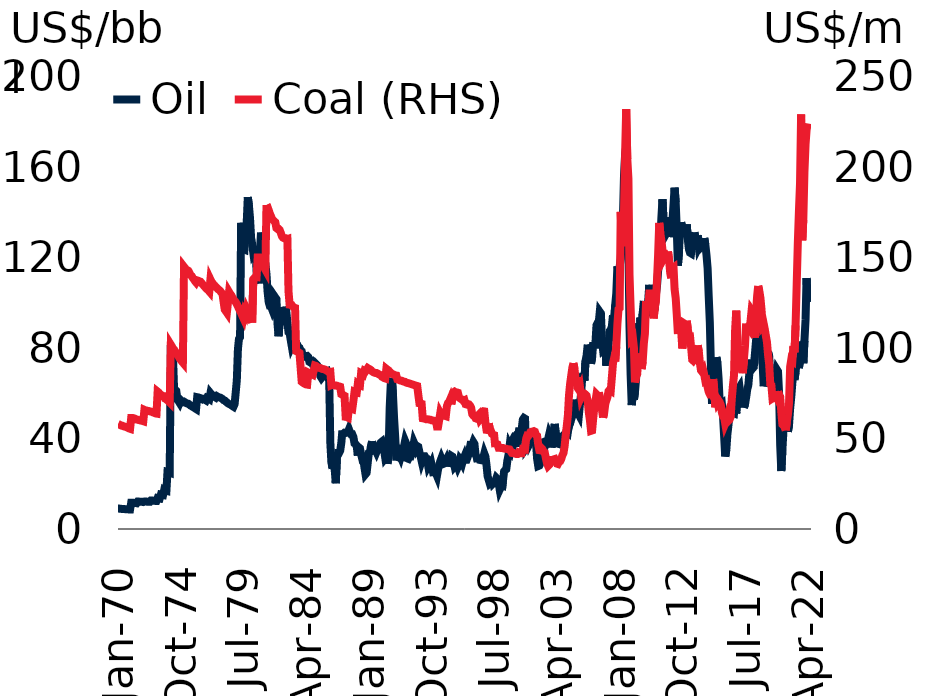
| Category | Oil |
|---|---|
| 1970-01-01 | 9 |
| 1970-02-01 | 9 |
| 1970-03-01 | 8.9 |
| 1970-04-01 | 8.9 |
| 1970-05-01 | 8.8 |
| 1970-06-01 | 8.8 |
| 1970-07-01 | 8.8 |
| 1970-08-01 | 8.7 |
| 1970-09-01 | 8.7 |
| 1970-10-01 | 8.7 |
| 1970-11-01 | 8.6 |
| 1970-12-01 | 8.6 |
| 1971-01-01 | 11.6 |
| 1971-02-01 | 11.6 |
| 1971-03-01 | 11.6 |
| 1971-04-01 | 11.5 |
| 1971-05-01 | 11.5 |
| 1971-06-01 | 11.4 |
| 1971-07-01 | 12.1 |
| 1971-08-01 | 12.1 |
| 1971-09-01 | 12 |
| 1971-10-01 | 12 |
| 1971-11-01 | 12 |
| 1971-12-01 | 11.9 |
| 1972-01-01 | 12.1 |
| 1972-02-01 | 12.1 |
| 1972-03-01 | 12.1 |
| 1972-04-01 | 12 |
| 1972-05-01 | 12 |
| 1972-06-01 | 12 |
| 1972-07-01 | 12.6 |
| 1972-08-01 | 12.6 |
| 1972-09-01 | 12.5 |
| 1972-10-01 | 12.5 |
| 1972-11-01 | 12.4 |
| 1972-12-01 | 12.4 |
| 1973-01-01 | 13.7 |
| 1973-02-01 | 13.6 |
| 1973-03-01 | 13.5 |
| 1973-04-01 | 15.2 |
| 1973-05-01 | 15.1 |
| 1973-06-01 | 15 |
| 1973-07-01 | 17.2 |
| 1973-08-01 | 16.9 |
| 1973-09-01 | 16.8 |
| 1973-10-01 | 25.3 |
| 1973-11-01 | 25.2 |
| 1973-12-01 | 25 |
| 1974-01-01 | 78.3 |
| 1974-02-01 | 77.5 |
| 1974-03-01 | 76.7 |
| 1974-04-01 | 62.1 |
| 1974-05-01 | 61.5 |
| 1974-06-01 | 61 |
| 1974-07-01 | 57.2 |
| 1974-08-01 | 56.5 |
| 1974-09-01 | 55.7 |
| 1974-10-01 | 56.9 |
| 1974-11-01 | 56.4 |
| 1974-12-01 | 56 |
| 1975-01-01 | 56.2 |
| 1975-02-01 | 55.9 |
| 1975-03-01 | 55.6 |
| 1975-04-01 | 55.4 |
| 1975-05-01 | 55.3 |
| 1975-06-01 | 54.9 |
| 1975-07-01 | 54.5 |
| 1975-08-01 | 54.3 |
| 1975-09-01 | 53.9 |
| 1975-10-01 | 53.7 |
| 1975-11-01 | 53.3 |
| 1975-12-01 | 53 |
| 1976-01-01 | 58.2 |
| 1976-02-01 | 58.1 |
| 1976-03-01 | 57.9 |
| 1976-04-01 | 57.8 |
| 1976-05-01 | 57.5 |
| 1976-06-01 | 57.2 |
| 1976-07-01 | 57.4 |
| 1976-08-01 | 57.1 |
| 1976-09-01 | 56.8 |
| 1976-10-01 | 57.9 |
| 1976-11-01 | 57.7 |
| 1976-12-01 | 57.4 |
| 1977-01-01 | 60 |
| 1977-02-01 | 59.4 |
| 1977-03-01 | 59.1 |
| 1977-04-01 | 58.5 |
| 1977-05-01 | 58.3 |
| 1977-06-01 | 58 |
| 1977-07-01 | 58.6 |
| 1977-08-01 | 58.3 |
| 1977-09-01 | 58.1 |
| 1977-10-01 | 58 |
| 1977-11-01 | 57.7 |
| 1977-12-01 | 57.4 |
| 1978-01-01 | 56.9 |
| 1978-02-01 | 56.7 |
| 1978-03-01 | 56.3 |
| 1978-04-01 | 55.9 |
| 1978-05-01 | 55.5 |
| 1978-06-01 | 55.2 |
| 1978-07-01 | 55 |
| 1978-08-01 | 54.7 |
| 1978-09-01 | 54.3 |
| 1978-10-01 | 54 |
| 1978-11-01 | 55.1 |
| 1978-12-01 | 60.2 |
| 1979-01-01 | 65.6 |
| 1979-02-01 | 79.4 |
| 1979-03-01 | 83.9 |
| 1979-04-01 | 84.7 |
| 1979-05-01 | 135.2 |
| 1979-06-01 | 128.3 |
| 1979-07-01 | 123.6 |
| 1979-08-01 | 123.4 |
| 1979-09-01 | 130.7 |
| 1979-10-01 | 135 |
| 1979-11-01 | 146.5 |
| 1979-12-01 | 143 |
| 1980-01-01 | 137.4 |
| 1980-02-01 | 128.5 |
| 1980-03-01 | 125.8 |
| 1980-04-01 | 122 |
| 1980-05-01 | 122.8 |
| 1980-06-01 | 123 |
| 1980-07-01 | 113.8 |
| 1980-08-01 | 109.5 |
| 1980-09-01 | 108.4 |
| 1980-10-01 | 122.5 |
| 1980-11-01 | 130.9 |
| 1980-12-01 | 128.4 |
| 1981-01-01 | 126.9 |
| 1981-02-01 | 118.9 |
| 1981-03-01 | 117.3 |
| 1981-04-01 | 112.5 |
| 1981-05-01 | 104.9 |
| 1981-06-01 | 100.2 |
| 1981-07-01 | 98.5 |
| 1981-08-01 | 98.4 |
| 1981-09-01 | 97.1 |
| 1981-10-01 | 98.6 |
| 1981-11-01 | 102.9 |
| 1981-12-01 | 102.2 |
| 1982-01-01 | 101.5 |
| 1982-02-01 | 90.5 |
| 1982-03-01 | 85.1 |
| 1982-04-01 | 91.6 |
| 1982-05-01 | 98 |
| 1982-06-01 | 94.9 |
| 1982-07-01 | 91.7 |
| 1982-08-01 | 90 |
| 1982-09-01 | 95.4 |
| 1982-10-01 | 96 |
| 1982-11-01 | 91.3 |
| 1982-12-01 | 86.9 |
| 1983-01-01 | 86.5 |
| 1983-02-01 | 83.4 |
| 1983-03-01 | 80.8 |
| 1983-04-01 | 81.9 |
| 1983-05-01 | 81 |
| 1983-06-01 | 81.5 |
| 1983-07-01 | 81.9 |
| 1983-08-01 | 81.4 |
| 1983-09-01 | 80.3 |
| 1983-10-01 | 80 |
| 1983-11-01 | 78.9 |
| 1983-12-01 | 78.5 |
| 1984-01-01 | 76.6 |
| 1984-02-01 | 76 |
| 1984-03-01 | 76.1 |
| 1984-04-01 | 76.3 |
| 1984-05-01 | 76.4 |
| 1984-06-01 | 75.9 |
| 1984-07-01 | 73.8 |
| 1984-08-01 | 73.5 |
| 1984-09-01 | 73.8 |
| 1984-10-01 | 72.7 |
| 1984-11-01 | 72.5 |
| 1984-12-01 | 71.5 |
| 1985-01-01 | 72.8 |
| 1985-02-01 | 72.3 |
| 1985-03-01 | 71.7 |
| 1985-04-01 | 70.2 |
| 1985-05-01 | 67.5 |
| 1985-06-01 | 66.7 |
| 1985-07-01 | 67.3 |
| 1985-08-01 | 68.7 |
| 1985-09-01 | 68.2 |
| 1985-10-01 | 69.4 |
| 1985-11-01 | 69.6 |
| 1985-12-01 | 67.7 |
| 1986-01-01 | 65.2 |
| 1986-02-01 | 38 |
| 1986-03-01 | 29.6 |
| 1986-04-01 | 26.7 |
| 1986-05-01 | 29.7 |
| 1986-06-01 | 26.3 |
| 1986-07-01 | 20.2 |
| 1986-08-01 | 31.3 |
| 1986-09-01 | 33.6 |
| 1986-10-01 | 33.6 |
| 1986-11-01 | 34.6 |
| 1986-12-01 | 37.9 |
| 1987-01-01 | 43.5 |
| 1987-02-01 | 42.1 |
| 1987-03-01 | 42.5 |
| 1987-04-01 | 42.4 |
| 1987-05-01 | 42.5 |
| 1987-06-01 | 42.8 |
| 1987-07-01 | 44 |
| 1987-08-01 | 42.7 |
| 1987-09-01 | 41.8 |
| 1987-10-01 | 41.8 |
| 1987-11-01 | 40.6 |
| 1987-12-01 | 37.8 |
| 1988-01-01 | 37.4 |
| 1988-02-01 | 36.5 |
| 1988-03-01 | 32.4 |
| 1988-04-01 | 36 |
| 1988-05-01 | 35.6 |
| 1988-06-01 | 33 |
| 1988-07-01 | 31 |
| 1988-08-01 | 31.2 |
| 1988-09-01 | 27.2 |
| 1988-10-01 | 24.2 |
| 1988-11-01 | 24.8 |
| 1988-12-01 | 29.2 |
| 1989-01-01 | 33.6 |
| 1989-02-01 | 33.9 |
| 1989-03-01 | 36.8 |
| 1989-04-01 | 38.7 |
| 1989-05-01 | 35.7 |
| 1989-06-01 | 35 |
| 1989-07-01 | 35.1 |
| 1989-08-01 | 34 |
| 1989-09-01 | 35.2 |
| 1989-10-01 | 36.3 |
| 1989-11-01 | 36.2 |
| 1989-12-01 | 38.2 |
| 1990-01-01 | 38.6 |
| 1990-02-01 | 37 |
| 1990-03-01 | 34.6 |
| 1990-04-01 | 31.3 |
| 1990-05-01 | 31.9 |
| 1990-06-01 | 28.8 |
| 1990-07-01 | 33.1 |
| 1990-08-01 | 53.6 |
| 1990-09-01 | 64.5 |
| 1990-10-01 | 66.7 |
| 1990-11-01 | 58.9 |
| 1990-12-01 | 48.8 |
| 1991-01-01 | 40.6 |
| 1991-02-01 | 30.2 |
| 1991-03-01 | 31.1 |
| 1991-04-01 | 32 |
| 1991-05-01 | 33.1 |
| 1991-06-01 | 31.9 |
| 1991-07-01 | 33.6 |
| 1991-08-01 | 34.4 |
| 1991-09-01 | 36.6 |
| 1991-10-01 | 38.9 |
| 1991-11-01 | 37.7 |
| 1991-12-01 | 31.2 |
| 1992-01-01 | 31 |
| 1992-02-01 | 32 |
| 1992-03-01 | 32 |
| 1992-04-01 | 33.8 |
| 1992-05-01 | 35.5 |
| 1992-06-01 | 38.2 |
| 1992-07-01 | 37.1 |
| 1992-08-01 | 35.6 |
| 1992-09-01 | 36.6 |
| 1992-10-01 | 36.3 |
| 1992-11-01 | 33.9 |
| 1992-12-01 | 32.2 |
| 1993-01-01 | 30 |
| 1993-02-01 | 31.5 |
| 1993-03-01 | 32.1 |
| 1993-04-01 | 32.1 |
| 1993-05-01 | 31.3 |
| 1993-06-01 | 30.5 |
| 1993-07-01 | 27.8 |
| 1993-08-01 | 28.7 |
| 1993-09-01 | 27.6 |
| 1993-10-01 | 28.7 |
| 1993-11-01 | 26.5 |
| 1993-12-01 | 23.4 |
| 1994-01-01 | 25.3 |
| 1994-02-01 | 24.6 |
| 1994-03-01 | 23.5 |
| 1994-04-01 | 26.4 |
| 1994-05-01 | 28.3 |
| 1994-06-01 | 29.9 |
| 1994-07-01 | 31.2 |
| 1994-08-01 | 30 |
| 1994-09-01 | 28.8 |
| 1994-10-01 | 29 |
| 1994-11-01 | 30 |
| 1994-12-01 | 27.6 |
| 1995-01-01 | 30.1 |
| 1995-02-01 | 31.1 |
| 1995-03-01 | 30.7 |
| 1995-04-01 | 32.3 |
| 1995-05-01 | 32 |
| 1995-06-01 | 30 |
| 1995-07-01 | 27.7 |
| 1995-08-01 | 28.3 |
| 1995-09-01 | 28.8 |
| 1995-10-01 | 27.4 |
| 1995-11-01 | 28.5 |
| 1995-12-01 | 30.8 |
| 1996-01-01 | 30.2 |
| 1996-02-01 | 29.2 |
| 1996-03-01 | 30.9 |
| 1996-04-01 | 32.1 |
| 1996-05-01 | 30.6 |
| 1996-06-01 | 30.6 |
| 1996-07-01 | 31.9 |
| 1996-08-01 | 33.7 |
| 1996-09-01 | 36.2 |
| 1996-10-01 | 38.7 |
| 1996-11-01 | 37.1 |
| 1996-12-01 | 38.4 |
| 1997-01-01 | 37.6 |
| 1997-02-01 | 32.8 |
| 1997-03-01 | 31.9 |
| 1997-04-01 | 29.6 |
| 1997-05-01 | 32.5 |
| 1997-06-01 | 30.5 |
| 1997-07-01 | 30.4 |
| 1997-08-01 | 31.2 |
| 1997-09-01 | 31.4 |
| 1997-10-01 | 33.3 |
| 1997-11-01 | 32 |
| 1997-12-01 | 28.2 |
| 1998-01-01 | 23.3 |
| 1998-02-01 | 21.6 |
| 1998-03-01 | 20.1 |
| 1998-04-01 | 20.5 |
| 1998-05-01 | 22.2 |
| 1998-06-01 | 20.2 |
| 1998-07-01 | 20.7 |
| 1998-08-01 | 21 |
| 1998-09-01 | 22.5 |
| 1998-10-01 | 22 |
| 1998-11-01 | 20.2 |
| 1998-12-01 | 17.4 |
| 1999-01-01 | 18.5 |
| 1999-02-01 | 17.2 |
| 1999-03-01 | 21.2 |
| 1999-04-01 | 25.4 |
| 1999-05-01 | 26 |
| 1999-06-01 | 26.4 |
| 1999-07-01 | 30.2 |
| 1999-08-01 | 32.6 |
| 1999-09-01 | 36.7 |
| 1999-10-01 | 35.7 |
| 1999-11-01 | 38.6 |
| 1999-12-01 | 39.5 |
| 2000-01-01 | 38.8 |
| 2000-02-01 | 40.9 |
| 2000-03-01 | 41.4 |
| 2000-04-01 | 36.3 |
| 2000-05-01 | 41.8 |
| 2000-06-01 | 44.7 |
| 2000-07-01 | 42.5 |
| 2000-08-01 | 44.2 |
| 2000-09-01 | 48.3 |
| 2000-10-01 | 49 |
| 2000-11-01 | 48.7 |
| 2000-12-01 | 35.7 |
| 2001-01-01 | 36.4 |
| 2001-02-01 | 39.6 |
| 2001-03-01 | 37.5 |
| 2001-04-01 | 38.5 |
| 2001-05-01 | 40.7 |
| 2001-06-01 | 40.6 |
| 2001-07-01 | 37.2 |
| 2001-08-01 | 38.7 |
| 2001-09-01 | 37.9 |
| 2001-10-01 | 31 |
| 2001-11-01 | 27.8 |
| 2001-12-01 | 28 |
| 2002-01-01 | 29 |
| 2002-02-01 | 30 |
| 2002-03-01 | 36.1 |
| 2002-04-01 | 38.4 |
| 2002-05-01 | 38.6 |
| 2002-06-01 | 37.4 |
| 2002-07-01 | 38.5 |
| 2002-08-01 | 39.6 |
| 2002-09-01 | 41.8 |
| 2002-10-01 | 40.7 |
| 2002-11-01 | 36 |
| 2002-12-01 | 39.9 |
| 2003-01-01 | 43.3 |
| 2003-02-01 | 46.4 |
| 2003-03-01 | 42 |
| 2003-04-01 | 36.1 |
| 2003-05-01 | 37.4 |
| 2003-06-01 | 39.3 |
| 2003-07-01 | 40.9 |
| 2003-08-01 | 42.2 |
| 2003-09-01 | 38.5 |
| 2003-10-01 | 41.4 |
| 2003-11-01 | 41.9 |
| 2003-12-01 | 42.3 |
| 2004-01-01 | 43.4 |
| 2004-02-01 | 42.9 |
| 2004-03-01 | 45.9 |
| 2004-04-01 | 46.7 |
| 2004-05-01 | 51.6 |
| 2004-06-01 | 49.9 |
| 2004-07-01 | 51.4 |
| 2004-08-01 | 57.1 |
| 2004-09-01 | 52.7 |
| 2004-10-01 | 55.5 |
| 2004-11-01 | 51.3 |
| 2004-12-01 | 50.4 |
| 2005-01-01 | 55.6 |
| 2005-02-01 | 60 |
| 2005-03-01 | 66.5 |
| 2005-04-01 | 68.6 |
| 2005-05-01 | 65.5 |
| 2005-06-01 | 74.2 |
| 2005-07-01 | 76.5 |
| 2005-08-01 | 81.4 |
| 2005-09-01 | 80.2 |
| 2005-10-01 | 76 |
| 2005-11-01 | 73 |
| 2005-12-01 | 75.6 |
| 2006-01-01 | 82.5 |
| 2006-02-01 | 81.4 |
| 2006-03-01 | 81.4 |
| 2006-04-01 | 90 |
| 2006-05-01 | 90.9 |
| 2006-06-01 | 90.9 |
| 2006-07-01 | 95.9 |
| 2006-08-01 | 95.2 |
| 2006-09-01 | 83.1 |
| 2006-10-01 | 78.9 |
| 2006-11-01 | 79.3 |
| 2006-12-01 | 81.4 |
| 2007-01-01 | 72.1 |
| 2007-02-01 | 76.9 |
| 2007-03-01 | 81.1 |
| 2007-04-01 | 87.4 |
| 2007-05-01 | 88 |
| 2007-06-01 | 89.5 |
| 2007-07-01 | 94.3 |
| 2007-08-01 | 91.2 |
| 2007-09-01 | 99 |
| 2007-10-01 | 104 |
| 2007-11-01 | 116 |
| 2007-12-01 | 114.3 |
| 2008-01-01 | 115.8 |
| 2008-02-01 | 119.3 |
| 2008-03-01 | 127.8 |
| 2008-04-01 | 136.4 |
| 2008-05-01 | 155.8 |
| 2008-06-01 | 165.4 |
| 2008-07-01 | 168.9 |
| 2008-08-01 | 146 |
| 2008-09-01 | 123.6 |
| 2008-10-01 | 89.2 |
| 2008-11-01 | 68 |
| 2008-12-01 | 54.7 |
| 2009-01-01 | 59.8 |
| 2009-02-01 | 57.2 |
| 2009-03-01 | 60.5 |
| 2009-04-01 | 66.5 |
| 2009-05-01 | 76 |
| 2009-06-01 | 90.8 |
| 2009-07-01 | 85.3 |
| 2009-08-01 | 93.3 |
| 2009-09-01 | 88.7 |
| 2009-10-01 | 95.4 |
| 2009-11-01 | 100.7 |
| 2009-12-01 | 97.9 |
| 2010-01-01 | 99.3 |
| 2010-02-01 | 95.5 |
| 2010-03-01 | 100.4 |
| 2010-04-01 | 107.8 |
| 2010-05-01 | 99.7 |
| 2010-06-01 | 96 |
| 2010-07-01 | 94.1 |
| 2010-08-01 | 96 |
| 2010-09-01 | 97.2 |
| 2010-10-01 | 103.4 |
| 2010-11-01 | 107.5 |
| 2010-12-01 | 113.9 |
| 2011-01-01 | 117.7 |
| 2011-02-01 | 127.4 |
| 2011-03-01 | 137.2 |
| 2011-04-01 | 145.6 |
| 2011-05-01 | 136 |
| 2011-06-01 | 134.8 |
| 2011-07-01 | 137.6 |
| 2011-08-01 | 131 |
| 2011-09-01 | 131.9 |
| 2011-10-01 | 128.9 |
| 2011-11-01 | 134.8 |
| 2011-12-01 | 131.8 |
| 2012-01-01 | 135.8 |
| 2012-02-01 | 143.4 |
| 2012-03-01 | 150.7 |
| 2012-04-01 | 144.2 |
| 2012-05-01 | 132 |
| 2012-06-01 | 116.3 |
| 2012-07-01 | 122.4 |
| 2012-08-01 | 132.9 |
| 2012-09-01 | 135.4 |
| 2012-10-01 | 132.3 |
| 2012-11-01 | 130.6 |
| 2012-12-01 | 128.9 |
| 2013-01-01 | 130.9 |
| 2013-02-01 | 134.5 |
| 2013-03-01 | 127.9 |
| 2013-04-01 | 123.6 |
| 2013-05-01 | 122 |
| 2013-06-01 | 121.7 |
| 2013-07-01 | 125.1 |
| 2013-08-01 | 129.2 |
| 2013-09-01 | 130.9 |
| 2013-10-01 | 128.3 |
| 2013-11-01 | 127.5 |
| 2013-12-01 | 129.6 |
| 2014-01-01 | 124.6 |
| 2014-02-01 | 125.6 |
| 2014-03-01 | 124.4 |
| 2014-04-01 | 124.9 |
| 2014-05-01 | 125.7 |
| 2014-06-01 | 128.4 |
| 2014-07-01 | 125.5 |
| 2014-08-01 | 120.9 |
| 2014-09-01 | 115.1 |
| 2014-10-01 | 102.8 |
| 2014-11-01 | 91.3 |
| 2014-12-01 | 72.2 |
| 2015-01-01 | 55.2 |
| 2015-02-01 | 66.9 |
| 2015-03-01 | 65.6 |
| 2015-04-01 | 70.2 |
| 2015-05-01 | 75.8 |
| 2015-06-01 | 73.3 |
| 2015-07-01 | 66.6 |
| 2015-08-01 | 55.9 |
| 2015-09-01 | 54.8 |
| 2015-10-01 | 55.2 |
| 2015-11-01 | 50 |
| 2015-12-01 | 41.2 |
| 2016-01-01 | 32 |
| 2016-02-01 | 35 |
| 2016-03-01 | 41.7 |
| 2016-04-01 | 46.1 |
| 2016-05-01 | 51.7 |
| 2016-06-01 | 53.8 |
| 2016-07-01 | 50 |
| 2016-08-01 | 51.3 |
| 2016-09-01 | 51.1 |
| 2016-10-01 | 56.3 |
| 2016-11-01 | 51 |
| 2016-12-01 | 60.2 |
| 2017-01-01 | 61.8 |
| 2017-02-01 | 62.6 |
| 2017-03-01 | 59.1 |
| 2017-04-01 | 60.6 |
| 2017-05-01 | 58.1 |
| 2017-06-01 | 53.6 |
| 2017-07-01 | 55 |
| 2017-08-01 | 58 |
| 2017-09-01 | 61.6 |
| 2017-10-01 | 63.5 |
| 2017-11-01 | 69.1 |
| 2017-12-01 | 69.9 |
| 2018-01-01 | 74.8 |
| 2018-02-01 | 71 |
| 2018-03-01 | 71.5 |
| 2018-04-01 | 77.1 |
| 2018-05-01 | 82.8 |
| 2018-06-01 | 82.2 |
| 2018-07-01 | 81.6 |
| 2018-08-01 | 80.8 |
| 2018-09-01 | 86.1 |
| 2018-10-01 | 88 |
| 2018-11-01 | 72.7 |
| 2018-12-01 | 63 |
| 2019-01-01 | 65.8 |
| 2019-02-01 | 71.6 |
| 2019-03-01 | 74.1 |
| 2019-04-01 | 78.1 |
| 2019-05-01 | 76.3 |
| 2019-06-01 | 67.7 |
| 2019-07-01 | 69.3 |
| 2019-08-01 | 64.8 |
| 2019-09-01 | 66.8 |
| 2019-10-01 | 64.1 |
| 2019-11-01 | 67.2 |
| 2019-12-01 | 70.3 |
| 2020-01-01 | 69.5 |
| 2020-02-01 | 59.3 |
| 2020-03-01 | 36.9 |
| 2020-04-01 | 25.6 |
| 2020-05-01 | 34.8 |
| 2020-06-01 | 44 |
| 2020-07-01 | 46.5 |
| 2020-08-01 | 47.5 |
| 2020-09-01 | 44.5 |
| 2020-10-01 | 43 |
| 2020-11-01 | 46 |
| 2020-12-01 | 53.1 |
| 2021-01-01 | 58.2 |
| 2021-02-01 | 64.6 |
| 2021-03-01 | 68 |
| 2021-04-01 | 65.9 |
| 2021-05-01 | 69.3 |
| 2021-06-01 | 73.8 |
| 2021-07-01 | 75.6 |
| 2021-08-01 | 71.1 |
| 2021-09-01 | 74.3 |
| 2021-10-01 | 82.8 |
| 2021-11-01 | 80.8 |
| 2021-12-01 | 73.2 |
| 2022-01-01 | 83.1 |
| 2022-02-01 | 92.4 |
| 2022-03-01 | 110.8 |
| 2022-04-01 | 100.3 |